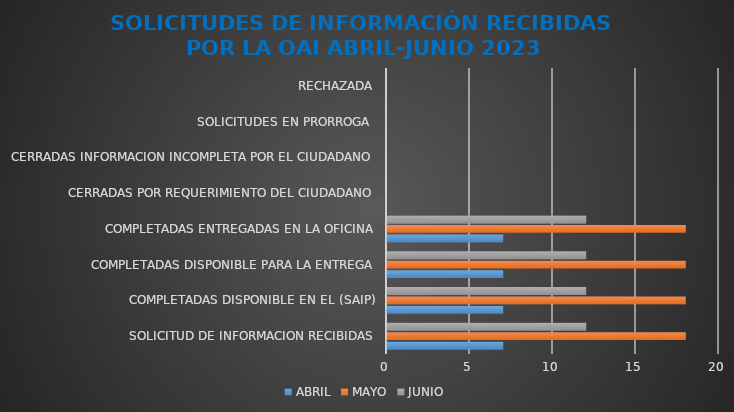
| Category | ABRIL | MAYO | JUNIO |
|---|---|---|---|
| SOLICITUD DE INFORMACION RECIBIDAS | 7 | 18 | 12 |
| COMPLETADAS DISPONIBLE EN EL (SAIP) | 7 | 18 | 12 |
| COMPLETADAS DISPONIBLE PARA LA ENTREGA | 7 | 18 | 12 |
| COMPLETADAS ENTREGADAS EN LA OFICINA | 7 | 18 | 12 |
| CERRADAS POR REQUERIMIENTO DEL CIUDADANO | 0 | 0 | 0 |
| CERRADAS INFORMACION INCOMPLETA POR EL CIUDADANO | 0 | 0 | 0 |
| SOLICITUDES EN PRORROGA  | 0 | 0 | 0 |
| RECHAZADA | 0 | 0 | 0 |